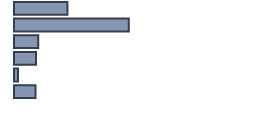
| Category | Percentatge |
|---|---|
| 0 | 22.261 |
| 1 | 47.826 |
| 2 | 10.087 |
| 3 | 9.174 |
| 4 | 1.696 |
| 5 | 8.957 |